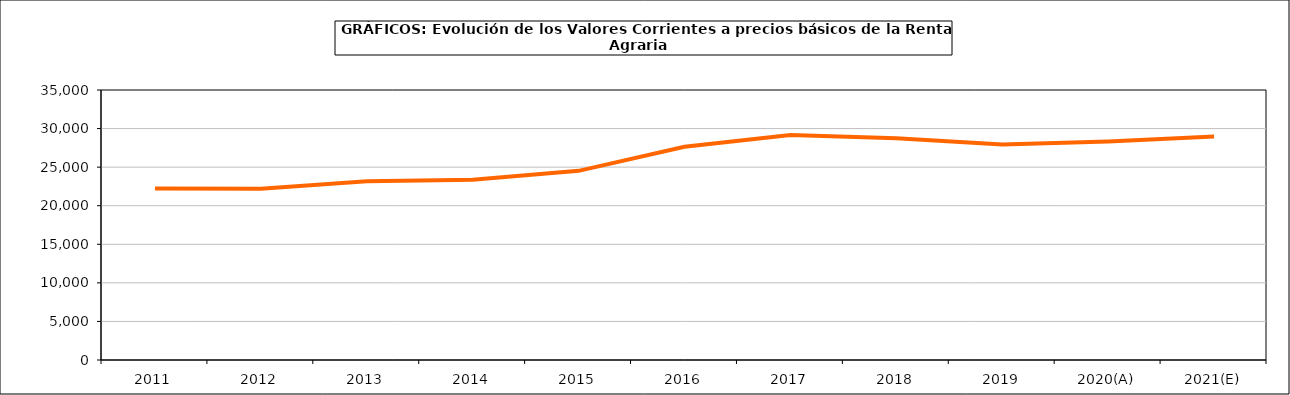
| Category | renta agraria |
|---|---|
| 2011 | 22219.2 |
| 2012 | 22193.5 |
| 2013 | 23161.5 |
| 2014 | 23361.1 |
| 2015 | 24518.8 |
| 2016 | 27646.8 |
| 2017 | 29152.2 |
| 2018 | 28755.3 |
| 2019 | 27946.4 |
| 2020(A) | 28328.4 |
| 2021(E) | 28985.4 |